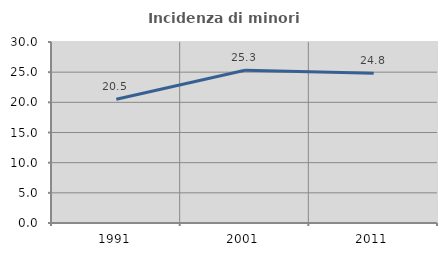
| Category | Incidenza di minori stranieri |
|---|---|
| 1991.0 | 20.52 |
| 2001.0 | 25.325 |
| 2011.0 | 24.81 |